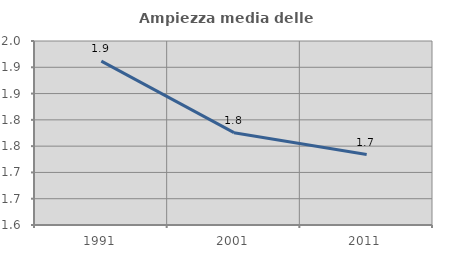
| Category | Ampiezza media delle famiglie |
|---|---|
| 1991.0 | 1.912 |
| 2001.0 | 1.776 |
| 2011.0 | 1.734 |